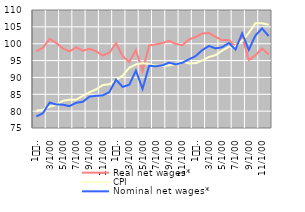
| Category | Real net wages* | CPI | Nominal net wages* |
|---|---|---|---|
| 1
2010 | 97.83 | 80.164 | 78.425 |
| 2 | 98.777 | 80.4 | 79.417 |
| 3 | 101.47 | 81.345 | 82.541 |
| 4 | 100.185 | 81.817 | 81.969 |
| 5 | 98.611 | 83.077 | 81.923 |
| 6 | 97.711 | 83.392 | 81.483 |
| 7 | 98.923 | 83.392 | 82.494 |
| 8 | 97.914 | 84.528 | 82.765 |
| 9 | 98.487 | 85.597 | 84.303 |
| 10 | 97.778 | 86.464 | 84.542 |
| 11 | 96.514 | 87.723 | 84.666 |
| 12 | 97.328 | 87.995 | 85.644 |
| 1
2011 | 100.15 | 89.201 | 89.334 |
| 2 | 96.33 | 90.504 | 87.183 |
| 3 | 94.574 | 92.879 | 87.839 |
| 4 | 98.05 | 93.855 | 92.025 |
| 5 | 91.928 | 94.211 | 86.606 |
| 6 | 99.485 | 93.97 | 93.486 |
| 7 | 99.803 | 93.471 | 93.286 |
| 8 | 100.184 | 93.426 | 93.598 |
| 9 | 100.867 | 93.567 | 94.379 |
| 10 | 99.922 | 93.96 | 93.886 |
| 11 | 99.568 | 94.796 | 94.386 |
| 12 | 101.284 | 94.148 | 95.357 |
| 1
2012 | 101.98 | 94.239 | 96.359 |
| 2 | 103.027 | 95.019 | 98.109 |
| 3 | 103.177 | 96.061 | 99.331 |
| 4 | 102.03 | 96.638 | 98.6 |
| 5 | 101.035 | 97.961 | 98.975 |
| 6 | 101.131 | 99.085 | 100.205 |
| 7 | 99.047 | 99.219 | 98.273 |
| 8 | 102.211 | 100.843 | 103.073 |
| 9 | 95.152 | 103.197 | 98.194 |
| 10 | 96.562 | 106.074 | 102.427 |
| 11 | 98.577 | 106.052 | 104.542 |
| 12 | 96.834 | 105.613 | 102.269 |